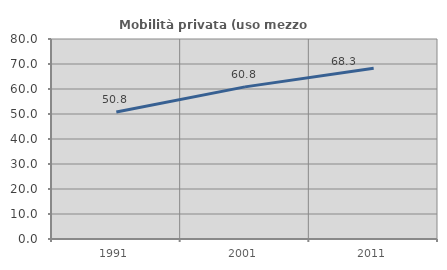
| Category | Mobilità privata (uso mezzo privato) |
|---|---|
| 1991.0 | 50.8 |
| 2001.0 | 60.844 |
| 2011.0 | 68.269 |